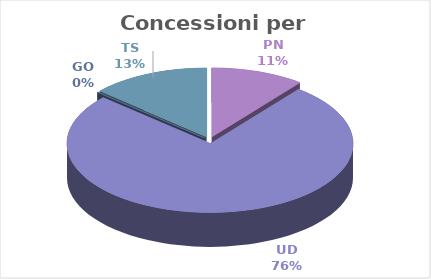
| Category | Series 0 |
|---|---|
| PN | 1409000 |
| UD | 10138000 |
| GO | 0 |
| TS | 1792500 |